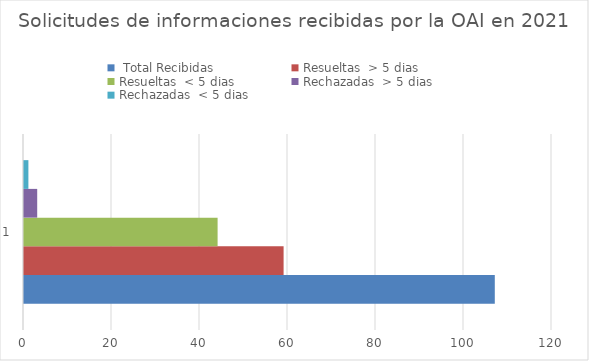
| Category | Series 0 | Resueltas | Rechazadas  |
|---|---|---|---|
| 0 | 107 | 44 | 1 |